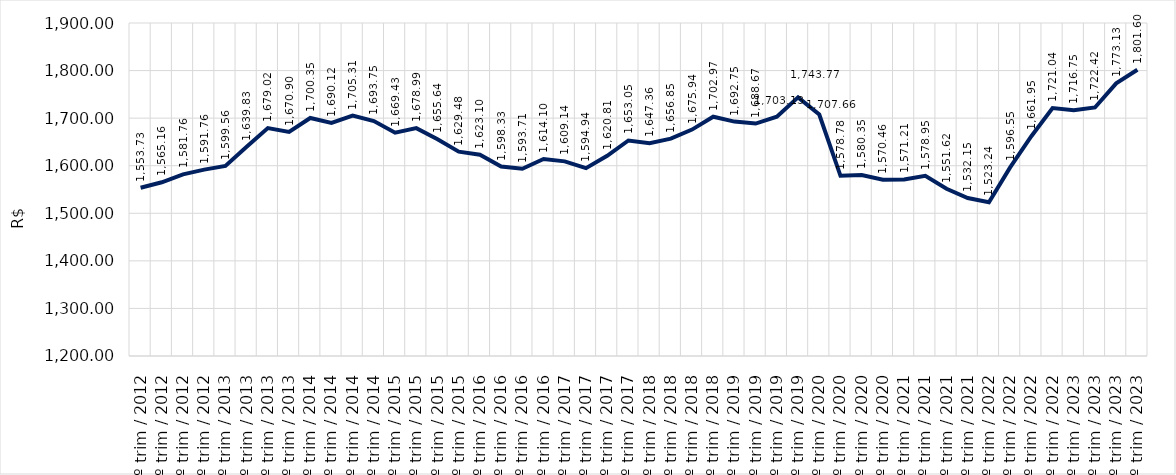
| Category | Series 0 |
|---|---|
| 1º trim / 2012 | 1553.733 |
| 2º trim / 2012 | 1565.157 |
| 3º trim / 2012 | 1581.76 |
| 4º trim / 2012 | 1591.764 |
| 1º trim / 2013 | 1599.556 |
| 2º trim / 2013 | 1639.829 |
| 3º trim / 2013 | 1679.022 |
| 4º trim / 2013 | 1670.901 |
| 1º trim / 2014 | 1700.353 |
| 2º trim / 2014 | 1690.118 |
| 3º trim / 2014 | 1705.308 |
| 4º trim / 2014 | 1693.752 |
| 1º trim / 2015 | 1669.433 |
| 2º trim / 2015 | 1678.991 |
| 3º trim / 2015 | 1655.637 |
| 4º trim / 2015 | 1629.477 |
| 1º trim / 2016 | 1623.103 |
| 2º trim / 2016 | 1598.329 |
| 3º trim / 2016 | 1593.708 |
| 4º trim / 2016 | 1614.103 |
| 1º trim / 2017 | 1609.138 |
| 2º trim / 2017 | 1594.939 |
| 3º trim / 2017 | 1620.814 |
| 4º trim / 2017 | 1653.051 |
| 1º trim / 2018 | 1647.36 |
| 2º trim / 2018 | 1656.846 |
| 3º trim / 2018 | 1675.942 |
| 4º trim / 2018 | 1702.969 |
| 1º trim / 2019 | 1692.752 |
| 2º trim / 2019 | 1688.671 |
| 3º trim / 2019 | 1703.125 |
| 4º trim / 2019 | 1743.769 |
| 1º trim / 2020 | 1707.658 |
| 2º trim / 2020 | 1578.775 |
| 3º trim / 2020 | 1580.349 |
| 4º trim / 2020 | 1570.462 |
| 1º trim / 2021 | 1571.207 |
| 2º trim / 2021 | 1578.947 |
| 3º trim / 2021 | 1551.623 |
| 4º trim / 2021 | 1532.152 |
| 1º trim / 2022 | 1523.239 |
| 2º trim / 2022 | 1596.549 |
| 3º trim / 2022 | 1661.952 |
| 4º trim / 2022 | 1721.044 |
| 1º trim / 2023 | 1716.75 |
| 2º trim / 2023 | 1722.42 |
| 3º trim / 2023 | 1773.128 |
| 4º trim / 2023 | 1801.602 |